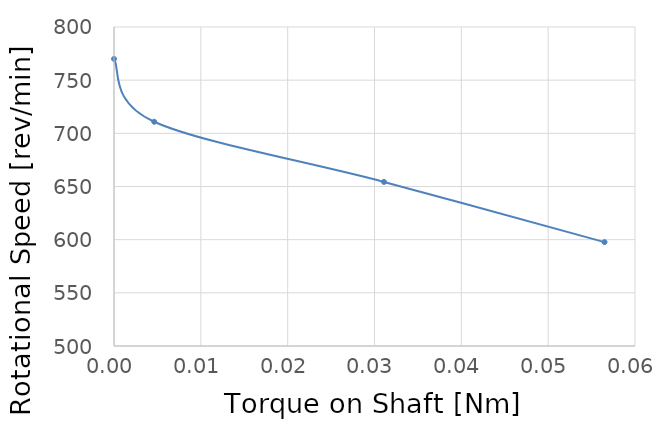
| Category | Torque on Shaft |
|---|---|
| 0.0 | 770 |
| 0.0046305 | 710.892 |
| 0.031090500000000004 | 654.304 |
| 0.056492099999999996 | 597.715 |